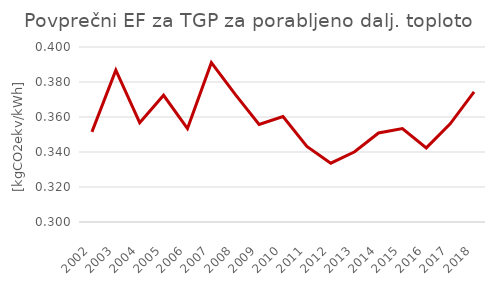
| Category | Series 0 |
|---|---|
| 2002.0 | 0.352 |
| 2003.0 | 0.387 |
| 2004.0 | 0.357 |
| 2005.0 | 0.372 |
| 2006.0 | 0.353 |
| 2007.0 | 0.391 |
| 2008.0 | 0.373 |
| 2009.0 | 0.356 |
| 2010.0 | 0.36 |
| 2011.0 | 0.343 |
| 2012.0 | 0.334 |
| 2013.0 | 0.34 |
| 2014.0 | 0.351 |
| 2015.0 | 0.353 |
| 2016.0 | 0.342 |
| 2017.0 | 0.356 |
| 2018.0 | 0.374 |